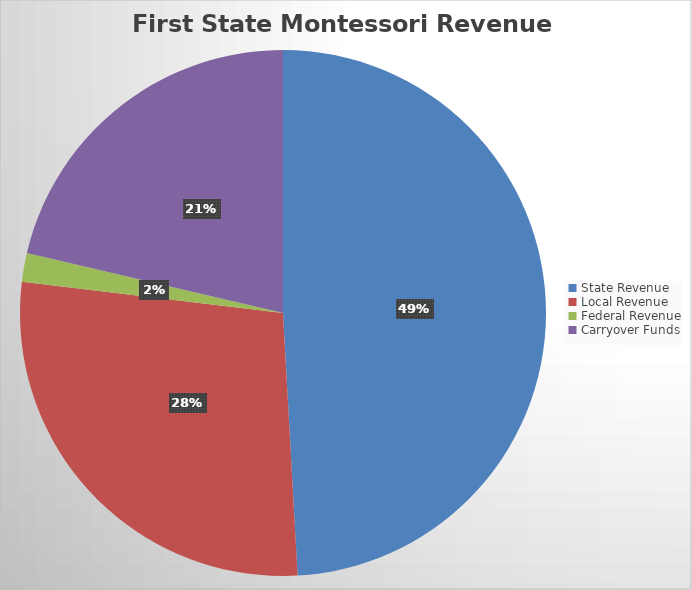
| Category | Series 0 |
|---|---|
| State Revenue | 6224717.76 |
| Local Revenue | 3520431.68 |
| Federal Revenue | 223890 |
| Carryover Funds | 2704941.32 |